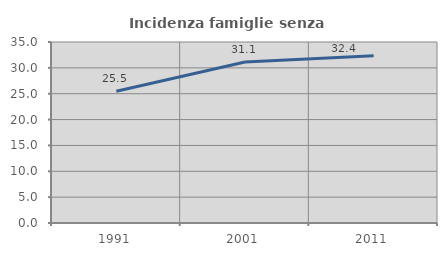
| Category | Incidenza famiglie senza nuclei |
|---|---|
| 1991.0 | 25.485 |
| 2001.0 | 31.117 |
| 2011.0 | 32.363 |